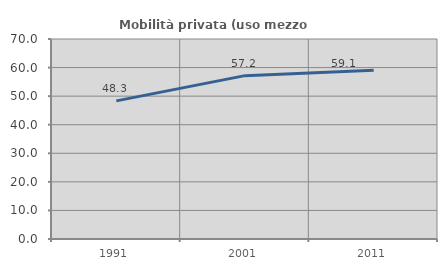
| Category | Mobilità privata (uso mezzo privato) |
|---|---|
| 1991.0 | 48.337 |
| 2001.0 | 57.179 |
| 2011.0 | 59.1 |